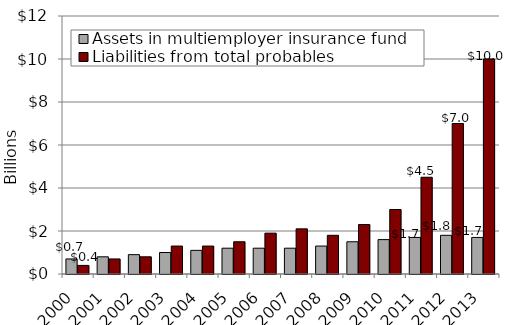
| Category | Assets in multiemployer insurance fund | Liabilities from total probables |
|---|---|---|
| 2000.0 | 0.7 | 0.4 |
| 2001.0 | 0.8 | 0.7 |
| 2002.0 | 0.9 | 0.8 |
| 2003.0 | 1 | 1.3 |
| 2004.0 | 1.1 | 1.3 |
| 2005.0 | 1.2 | 1.5 |
| 2006.0 | 1.2 | 1.9 |
| 2007.0 | 1.2 | 2.1 |
| 2008.0 | 1.3 | 1.8 |
| 2009.0 | 1.5 | 2.3 |
| 2010.0 | 1.6 | 3 |
| 2011.0 | 1.7 | 4.5 |
| 2012.0 | 1.8 | 7 |
| 2013.0 | 1.7 | 10 |